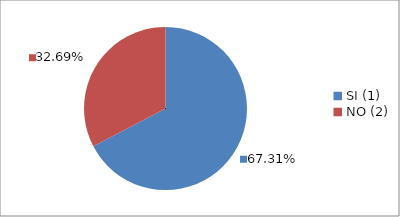
| Category | Series 0 |
|---|---|
| SI (1) | 0.673 |
| NO (2) | 0.327 |